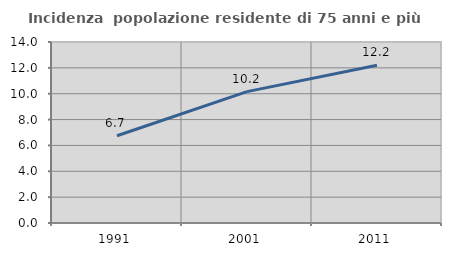
| Category | Incidenza  popolazione residente di 75 anni e più |
|---|---|
| 1991.0 | 6.748 |
| 2001.0 | 10.164 |
| 2011.0 | 12.203 |